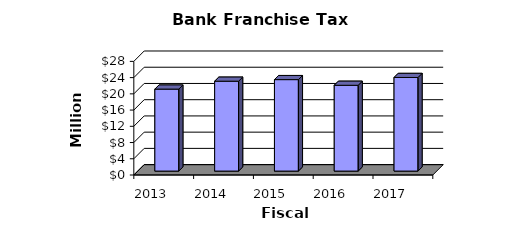
| Category | Series 0 |
|---|---|
| 2013.0 | 20202000 |
| 2014.0 | 22149000 |
| 2015.0 | 22539000 |
| 2016.0 | 21142000 |
| 2017.0 | 23068000 |